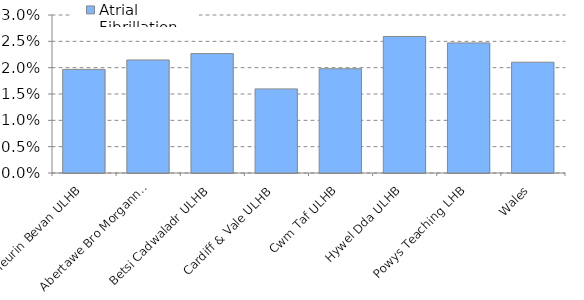
| Category | Atrial Fibrillation |
|---|---|
| Aneurin Bevan ULHB | 0.02 |
| Abertawe Bro Morgannwg ULHB | 0.021 |
| Betsi Cadwaladr ULHB | 0.023 |
| Cardiff & Vale ULHB | 0.016 |
| Cwm Taf ULHB | 0.02 |
| Hywel Dda ULHB | 0.026 |
| Powys Teaching LHB | 0.025 |
| Wales | 0.021 |